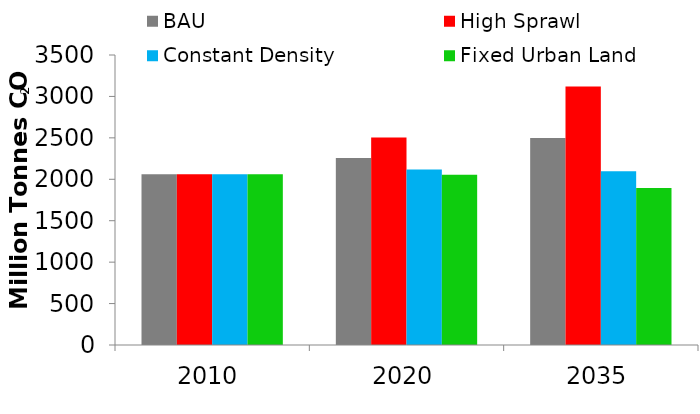
| Category | BAU | High Sprawl | Constant Density | Fixed Urban Land |
|---|---|---|---|---|
| 2010.0 | 2061.939 | 2061.939 | 2061.939 | 2061.939 |
| 2020.0 | 2255.547 | 2504.698 | 2117.485 | 2053.615 |
| 2035.0 | 2498.912 | 3119.602 | 2095.963 | 1896.163 |